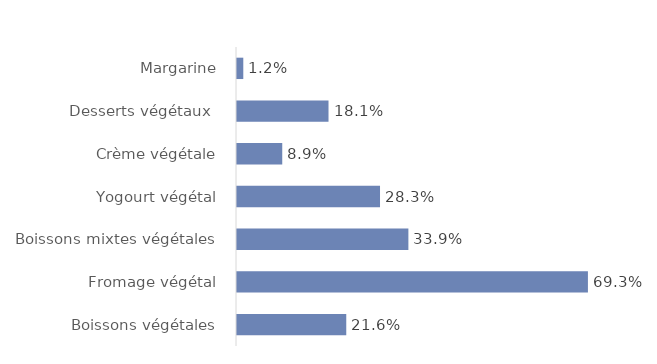
| Category | Δ 2017 à 2021 |
|---|---|
| Boissons végétales | 0.216 |
| Fromage végétal | 0.693 |
| Boissons mixtes végétales | 0.339 |
| Yogourt végétal | 0.283 |
| Crème végétale | 0.089 |
| Desserts végétaux  | 0.181 |
| Margarine | 0.012 |